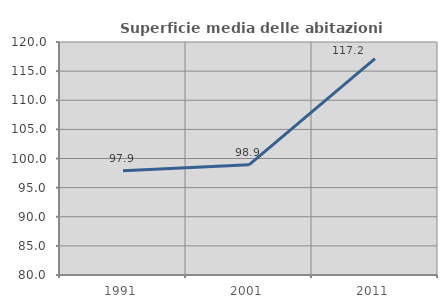
| Category | Superficie media delle abitazioni occupate |
|---|---|
| 1991.0 | 97.896 |
| 2001.0 | 98.917 |
| 2011.0 | 117.157 |